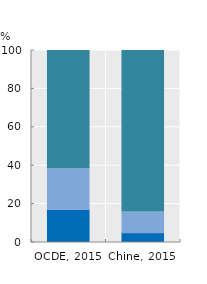
| Category | Recherche fondamentale | Recherche appliquée | Développement expérimental |
|---|---|---|---|
| OCDE, 2015 | 17.228 | 21.145 | 61.626 |
| Chine, 2015 | 5.054 | 10.788 | 84.158 |